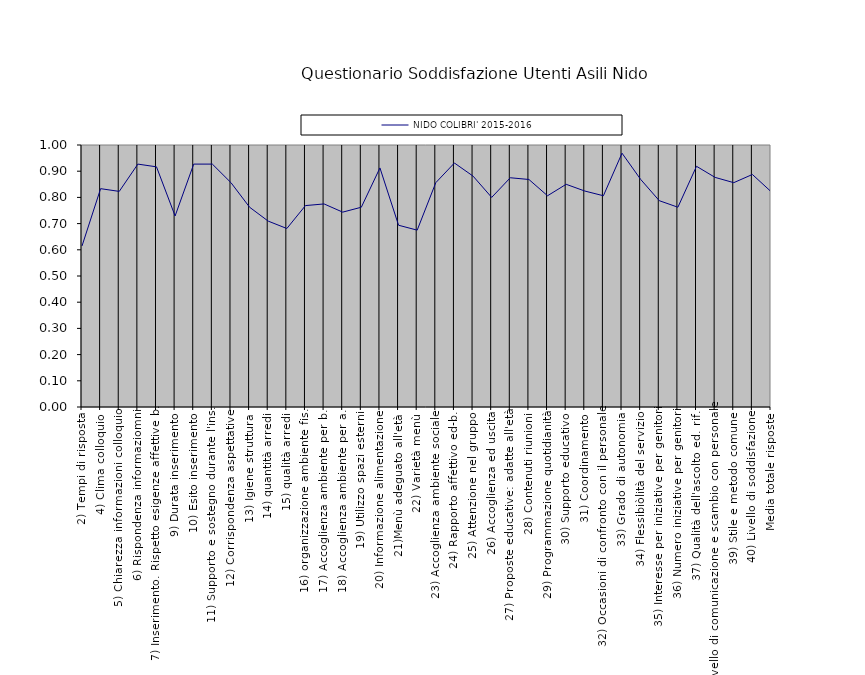
| Category | NIDO COLIBRI' 2015-2016 |
|---|---|
| 2) Tempi di risposta | 0.615 |
| 4) Clima colloquio | 0.833 |
| 5) Chiarezza informazioni colloquio | 0.823 |
| 6) Rispondenza informaziomni | 0.927 |
| 7) Inserimento. Rispetto esigenze affettive b. | 0.917 |
| 9) Durata inserimento | 0.729 |
| 10) Esito inserimento | 0.927 |
| 11) Supporto e sostegno durante l'ins. | 0.927 |
| 12) Corrispondenza aspettative | 0.856 |
| 13) Igiene struttura | 0.762 |
| 14) quantità arredi | 0.709 |
| 15) qualità arredi | 0.681 |
| 16) organizzazione ambiente fis. | 0.769 |
| 17) Accoglienza ambiente per b. | 0.775 |
| 18) Accoglienza ambiente per a. | 0.744 |
| 19) Utilizzo spazi esterni | 0.762 |
| 20) Informazione alimentazione | 0.912 |
| 21)Menù adeguato all'età | 0.694 |
| 22) Varietà menù | 0.675 |
| 23) Accoglienza ambiente sociale | 0.856 |
| 24) Rapporto affettivo ed-b. | 0.931 |
| 25) Attenzione nel gruppo | 0.881 |
| 26) Accoglienza ed uscita | 0.8 |
| 27) Proposte educative: adatte all'età | 0.875 |
| 28) Contenuti riunioni | 0.868 |
| 29) Programmazione quotidianità | 0.806 |
| 30) Supporto educativo | 0.85 |
| 31) Coordinamento | 0.824 |
| 32) Occasioni di confronto con il personale | 0.806 |
| 33) Grado di autonomia | 0.969 |
| 34) Flessibiòlità del servizio | 0.869 |
| 35) Interesse per iniziative per genitori | 0.788 |
| 36) Numero iniziative per genitori | 0.762 |
| 37) Qualità dell'ascolto ed. rif. | 0.919 |
| 38) Livello di comunicazione e scambio con personale | 0.876 |
| 39) Stile e metodo comune | 0.856 |
| 40) Livello di soddisfazione | 0.888 |
| Media totale risposte | 0.822 |